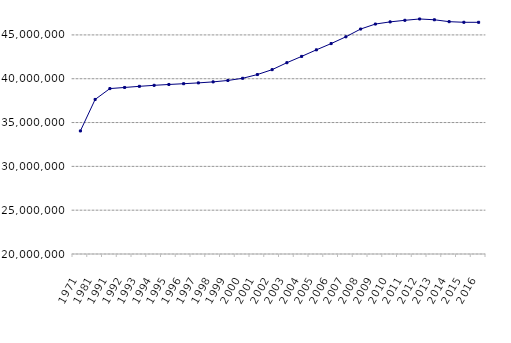
| Category | España |
|---|---|
| 1971.0 | 34041452 |
| 1981.0 | 37636201 |
| 1991.0 | 38874573 |
| 1992.0 | 39003524 |
| 1993.0 | 39131966 |
| 1994.0 | 39246833 |
| 1995.0 | 39343100 |
| 1996.0 | 39430933 |
| 1997.0 | 39525438 |
| 1998.0 | 39639388 |
| 1999.0 | 39802827 |
| 2000.0 | 40049708 |
| 2001.0 | 40476723 |
| 2002.0 | 41035271 |
| 2003.0 | 41827836 |
| 2004.0 | 42547454 |
| 2005.0 | 43296335 |
| 2006.0 | 44009969 |
| 2007.0 | 44784659 |
| 2008.0 | 45668938 |
| 2009.0 | 46239271 |
| 2010.0 | 46486621 |
| 2011.0 | 46667175 |
| 2012.0 | 46818216 |
| 2013.0 | 46727890 |
| 2014.0 | 46512198.941 |
| 2015.0 | 46439863.794 |
| 2016.0 | 46438422.318 |